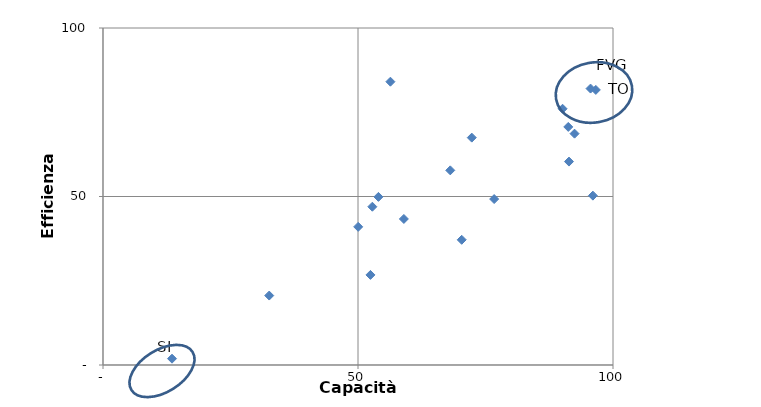
| Category | Series 0 |
|---|---|
| 68.09302197204083 | 57.761 |
| 92.46291448898585 | 68.647 |
| 96.63309309302774 | 81.628 |
| 56.355915517411034 | 84.068 |
| 110.10601630830736 | 76.549 |
| 90.10857345363408 | 76.036 |
| 91.37129630321388 | 60.362 |
| 52.44037147083267 | 26.732 |
| 96.05615640935812 | 50.256 |
| 112.42926997046597 | 80.654 |
| 91.23077782115979 | 70.646 |
| 95.60043548421339 | 82.029 |
| 76.69804822514148 | 49.244 |
| 70.3369711391469 | 37.155 |
| 58.99508706124611 | 43.336 |
| 52.81392977995621 | 46.967 |
| 50.037102899999994 | 40.999 |
| 72.30763305647191 | 67.466 |
| 13.53432332449909 | 1.874 |
| 54.00687541002971 | 49.889 |
| 32.592585932614135 | 20.605 |